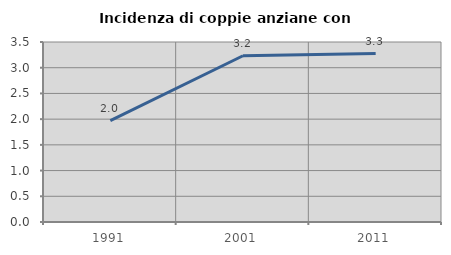
| Category | Incidenza di coppie anziane con figli |
|---|---|
| 1991.0 | 1.97 |
| 2001.0 | 3.232 |
| 2011.0 | 3.276 |